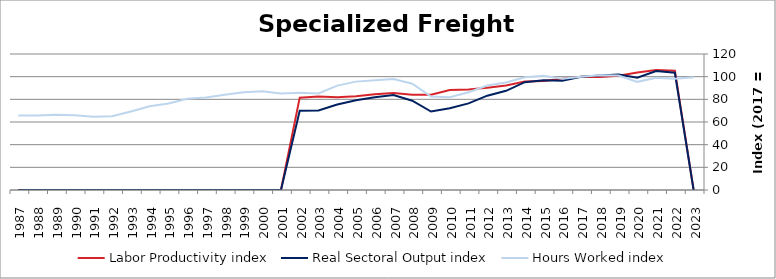
| Category | Labor Productivity index | Real Sectoral Output index | Hours Worked index |
|---|---|---|---|
| 2023.0 | 0 | 0 | 99.499 |
| 2022.0 | 105.317 | 103.44 | 98.218 |
| 2021.0 | 105.923 | 104.899 | 99.034 |
| 2020.0 | 103.745 | 99.004 | 95.431 |
| 2019.0 | 100.884 | 101.941 | 101.048 |
| 2018.0 | 99.692 | 100.999 | 101.31 |
| 2017.0 | 100 | 100 | 100 |
| 2016.0 | 98.198 | 96.362 | 98.13 |
| 2015.0 | 96.191 | 96.892 | 100.728 |
| 2014.0 | 95.731 | 95.176 | 99.42 |
| 2013.0 | 92.216 | 87.543 | 94.933 |
| 2012.0 | 90.246 | 83.218 | 92.212 |
| 2011.0 | 88.598 | 76.446 | 86.284 |
| 2010.0 | 88.196 | 72.143 | 81.799 |
| 2009.0 | 84.021 | 69.232 | 82.398 |
| 2008.0 | 84.073 | 78.81 | 93.74 |
| 2007.0 | 85.614 | 83.88 | 97.974 |
| 2006.0 | 84.462 | 81.811 | 96.861 |
| 2005.0 | 82.745 | 79.125 | 95.625 |
| 2004.0 | 81.815 | 75.369 | 92.121 |
| 2003.0 | 82.394 | 70.173 | 85.167 |
| 2002.0 | 81.505 | 70.011 | 85.897 |
| 2001.0 | 0 | 0 | 85.191 |
| 2000.0 | 0 | 0 | 87.212 |
| 1999.0 | 0 | 0 | 86.313 |
| 1998.0 | 0 | 0 | 84.086 |
| 1997.0 | 0 | 0 | 81.568 |
| 1996.0 | 0 | 0 | 80.501 |
| 1995.0 | 0 | 0 | 76.39 |
| 1994.0 | 0 | 0 | 73.866 |
| 1993.0 | 0 | 0 | 69.308 |
| 1992.0 | 0 | 0 | 65.062 |
| 1991.0 | 0 | 0 | 64.724 |
| 1990.0 | 0 | 0 | 65.901 |
| 1989.0 | 0 | 0 | 66.433 |
| 1988.0 | 0 | 0 | 65.742 |
| 1987.0 | 0 | 0 | 65.84 |